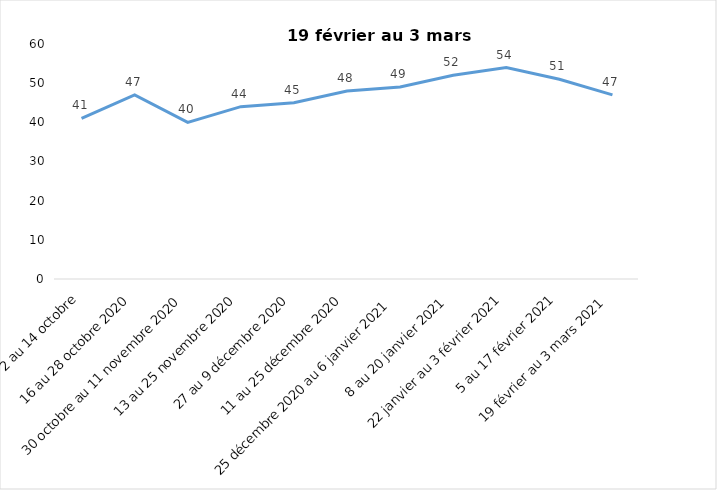
| Category | Toujours aux trois mesures |
|---|---|
| 2 au 14 octobre | 41 |
| 16 au 28 octobre 2020 | 47 |
| 30 octobre au 11 novembre 2020 | 40 |
| 13 au 25 novembre 2020 | 44 |
| 27 au 9 décembre 2020 | 45 |
| 11 au 25 décembre 2020 | 48 |
| 25 décembre 2020 au 6 janvier 2021 | 49 |
| 8 au 20 janvier 2021 | 52 |
| 22 janvier au 3 février 2021 | 54 |
| 5 au 17 février 2021 | 51 |
| 19 février au 3 mars 2021 | 47 |